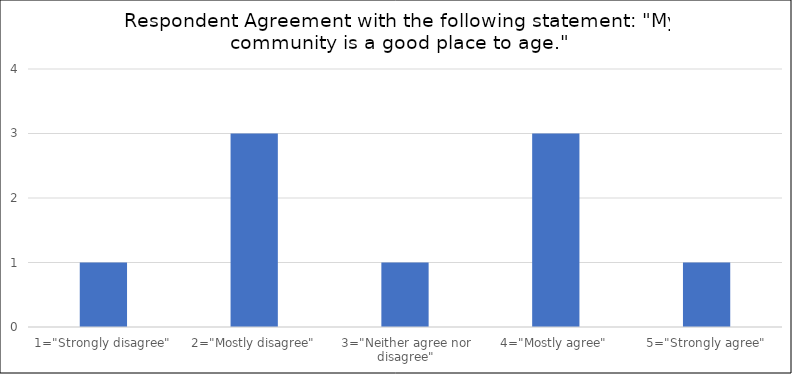
| Category | Number of Responses |
|---|---|
| 1="Strongly disagree" | 1 |
| 2="Mostly disagree" | 3 |
| 3="Neither agree nor disagree" | 1 |
| 4="Mostly agree" | 3 |
| 5="Strongly agree" | 1 |